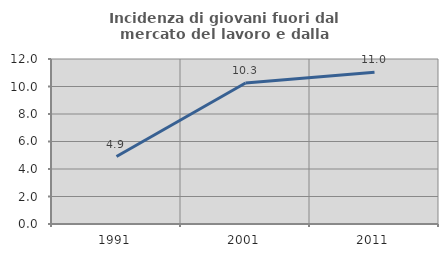
| Category | Incidenza di giovani fuori dal mercato del lavoro e dalla formazione  |
|---|---|
| 1991.0 | 4.909 |
| 2001.0 | 10.25 |
| 2011.0 | 11.034 |